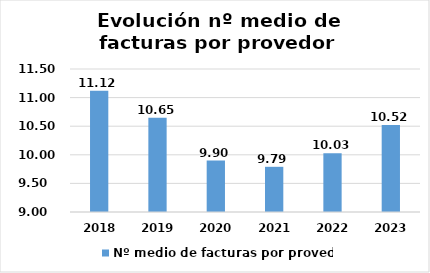
| Category | Nº medio de facturas por provedor |
|---|---|
| 2018.0 | 11.12 |
| 2019.0 | 10.649 |
| 2020.0 | 9.899 |
| 2021.0 | 9.79 |
| 2022.0 | 10.029 |
| 2023.0 | 10.52 |